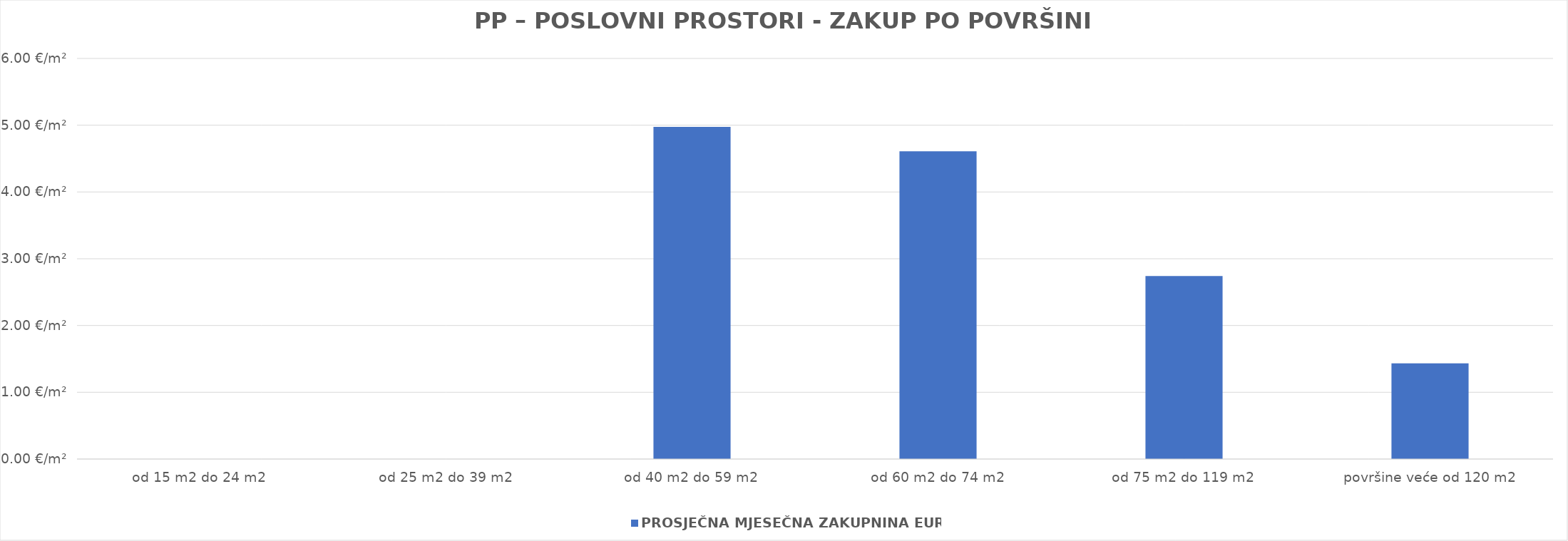
| Category | PROSJEČNA MJESEČNA ZAKUPNINA EUR/m2 |
|---|---|
| od 15 m2 do 24 m2 | 0 |
| od 25 m2 do 39 m2 | 0 |
| od 40 m2 do 59 m2 | 1900-01-04 23:25:55 |
| od 60 m2 do 74 m2 | 1900-01-04 14:36:08 |
| od 75 m2 do 119 m2 | 1900-01-02 17:46:19 |
| površine veće od 120 m2 | 1900-01-01 10:24:50 |